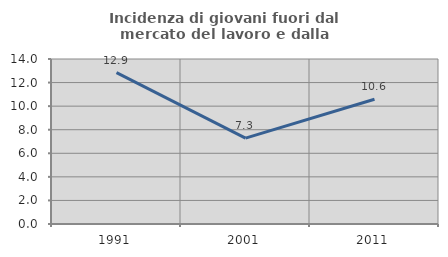
| Category | Incidenza di giovani fuori dal mercato del lavoro e dalla formazione  |
|---|---|
| 1991.0 | 12.851 |
| 2001.0 | 7.282 |
| 2011.0 | 10.583 |